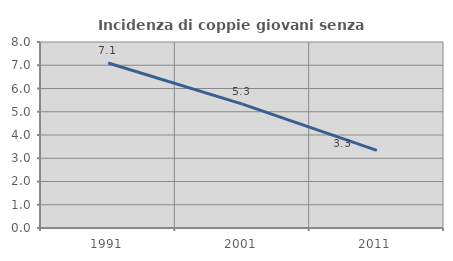
| Category | Incidenza di coppie giovani senza figli |
|---|---|
| 1991.0 | 7.098 |
| 2001.0 | 5.328 |
| 2011.0 | 3.338 |